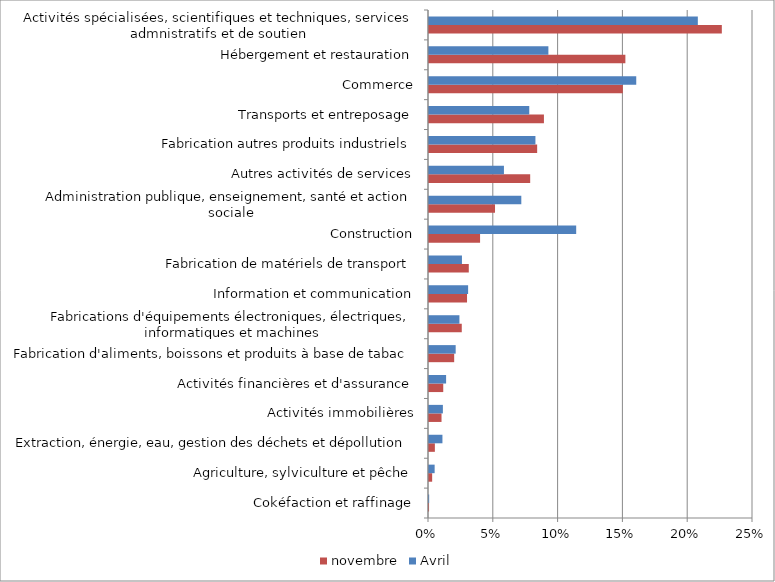
| Category | novembre | Avril |
|---|---|---|
| Cokéfaction et raffinage | 0 | 0 |
| Agriculture, sylviculture et pêche | 0.002 | 0.004 |
| Extraction, énergie, eau, gestion des déchets et dépollution | 0.005 | 0.01 |
| Activités immobilières | 0.01 | 0.011 |
| Activités financières et d'assurance | 0.011 | 0.013 |
| Fabrication d'aliments, boissons et produits à base de tabac | 0.019 | 0.021 |
| Fabrications d'équipements électroniques, électriques, informatiques et machines | 0.025 | 0.023 |
| Information et communication | 0.029 | 0.03 |
| Fabrication de matériels de transport | 0.031 | 0.025 |
| Construction | 0.039 | 0.114 |
| Administration publique, enseignement, santé et action sociale | 0.051 | 0.071 |
| Autres activités de services | 0.078 | 0.058 |
| Fabrication autres produits industriels | 0.083 | 0.082 |
| Transports et entreposage | 0.089 | 0.077 |
| Commerce | 0.15 | 0.16 |
| Hébergement et restauration | 0.152 | 0.092 |
| Activités spécialisées, scientifiques et techniques, services admnistratifs et de soutien | 0.226 | 0.207 |